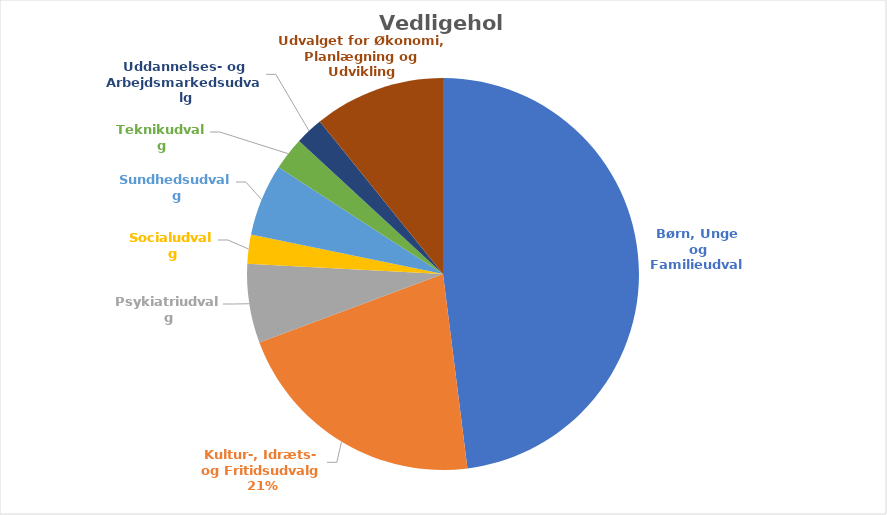
| Category | Sum af Vedligehold |
|---|---|
| Børn, Unge og Familieudvalg | 46101702 |
| Kultur-, Idræts- og Fritidsudvalg | 20460867 |
| Psykiatriudvalg | 6260150 |
| Socialudvalg | 2301800 |
| Sundhedsudvalg | 5693080 |
| Teknikudvalg | 2603023 |
| Uddannelses- og Arbejdsmarkedsudvalg | 2218250 |
| Udvalget for Økonomi, Planlægning og Udvikling | 10389200 |